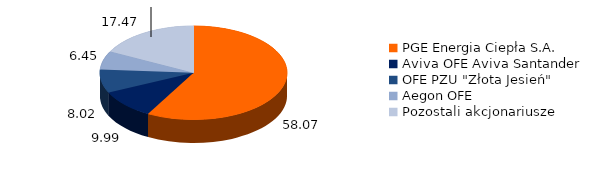
| Category | Series 2 | Series 3 | Series 1 | Series 0 |
|---|---|---|---|---|
| PGE Energia Ciepła S.A. | 58.068 | 0 | 8652173 | 8652173 |
| Aviva OFE Aviva Santander | 9.993 | 58.068 | 1489000 | 1489000 |
| OFE PZU "Złota Jesień" | 8.02 | 9.993 | 1195000 | 1195000 |
| Aegon OFE | 6.448 | 8.02 | 960690 | 960690 |
| Pozostali akcjonariusze | 17.471 | 6.448 | 2603137 | 2603137 |